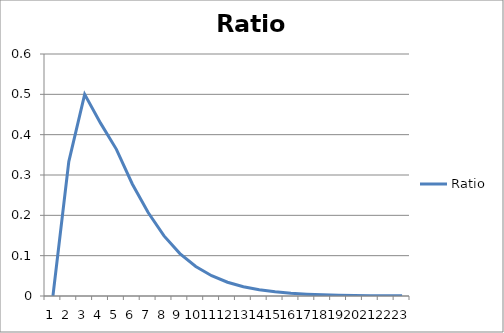
| Category | Ratio |
|---|---|
| 0 | 0 |
| 1 | 0.333 |
| 2 | 0.5 |
| 3 | 0.429 |
| 4 | 0.364 |
| 5 | 0.278 |
| 6 | 0.207 |
| 7 | 0.149 |
| 8 | 0.105 |
| 9 | 0.073 |
| 10 | 0.05 |
| 11 | 0.034 |
| 12 | 0.023 |
| 13 | 0.015 |
| 14 | 0.01 |
| 15 | 0.007 |
| 16 | 0.004 |
| 17 | 0.003 |
| 18 | 0.002 |
| 19 | 0.001 |
| 20 | 0.001 |
| 21 | 0.001 |
| 22 | 0 |